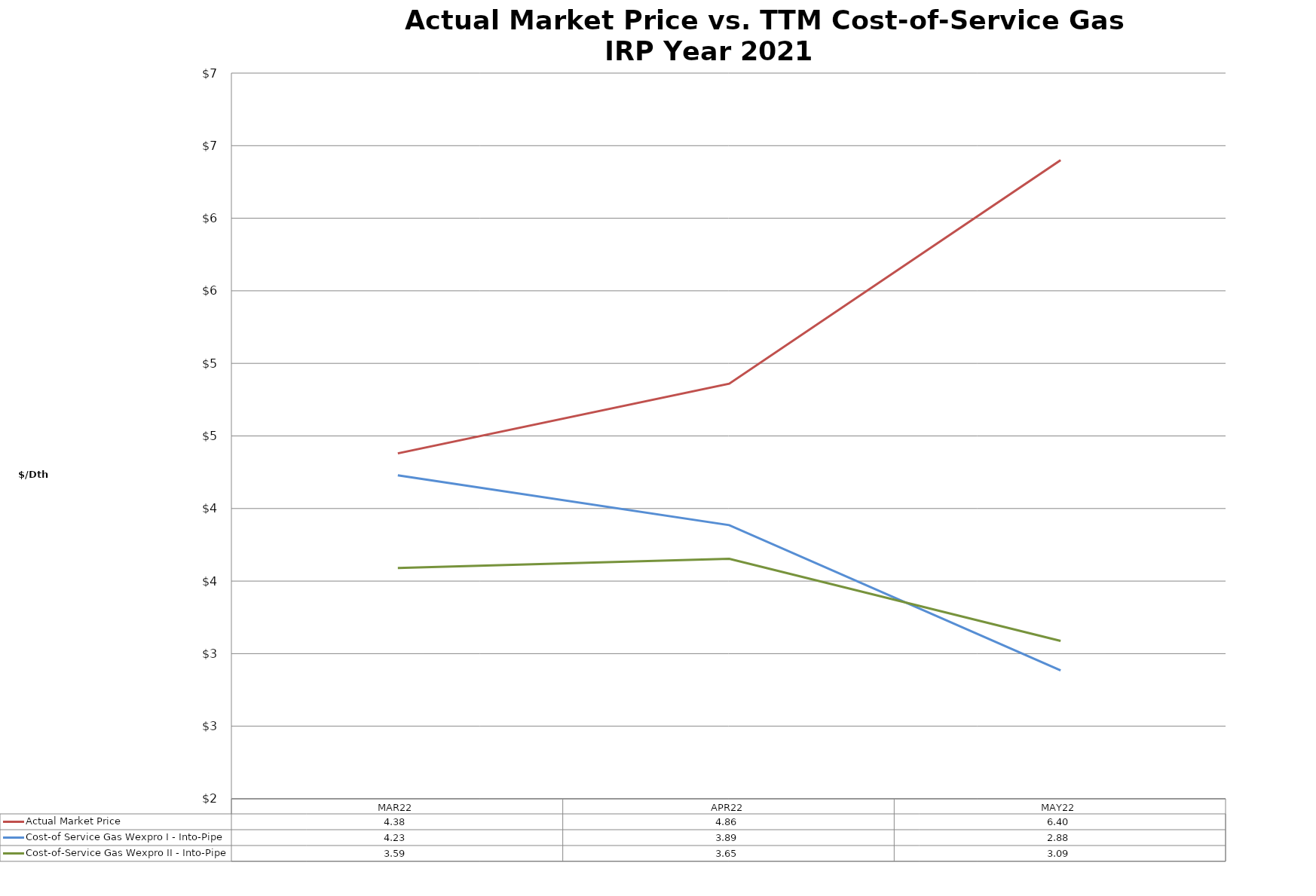
| Category | Actual Market Price | Cost-of Service Gas Wexpro I - Into-Pipe | Cost-of-Service Gas Wexpro II - Into-Pipe |
|---|---|---|---|
| MAR22 | 4.38 | 4.229 | 3.59 |
| APR22 | 4.86 | 3.886 | 3.654 |
| MAY22 | 6.4 | 2.885 | 3.087 |